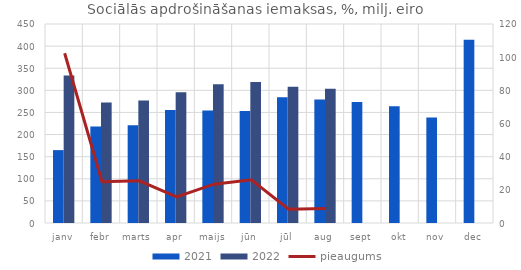
| Category | 2021 | 2022 |
|---|---|---|
| janv | 164.8 | 333.477 |
| febr | 218.091 | 272.477 |
| marts | 220.95 | 277.094 |
| apr | 255.257 | 295.571 |
| maijs | 254.326 | 313.846 |
| jūn | 253.083 | 318.981 |
| jūl | 284.509 | 308.24 |
| aug | 279.485 | 303.844 |
| sept | 273.9 | 0 |
| okt | 263.764 | 0 |
| nov | 238.667 | 0 |
| dec | 414.233 | 0 |